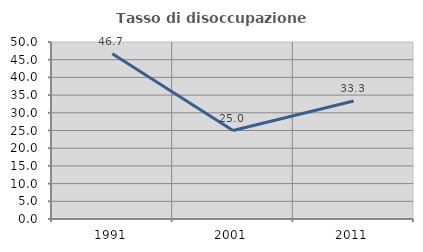
| Category | Tasso di disoccupazione giovanile  |
|---|---|
| 1991.0 | 46.667 |
| 2001.0 | 25 |
| 2011.0 | 33.333 |